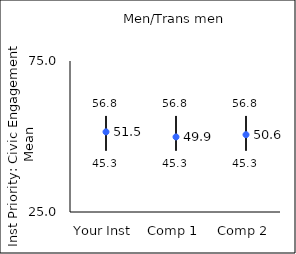
| Category | 25th percentile | 75th percentile | Mean |
|---|---|---|---|
| Your Inst | 45.3 | 56.8 | 51.54 |
| Comp 1 | 45.3 | 56.8 | 49.86 |
| Comp 2 | 45.3 | 56.8 | 50.6 |